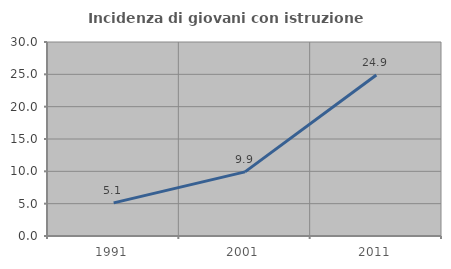
| Category | Incidenza di giovani con istruzione universitaria |
|---|---|
| 1991.0 | 5.116 |
| 2001.0 | 9.915 |
| 2011.0 | 24.891 |